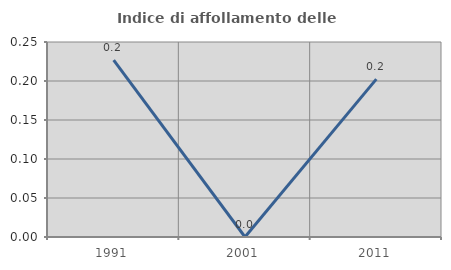
| Category | Indice di affollamento delle abitazioni  |
|---|---|
| 1991.0 | 0.227 |
| 2001.0 | 0 |
| 2011.0 | 0.202 |